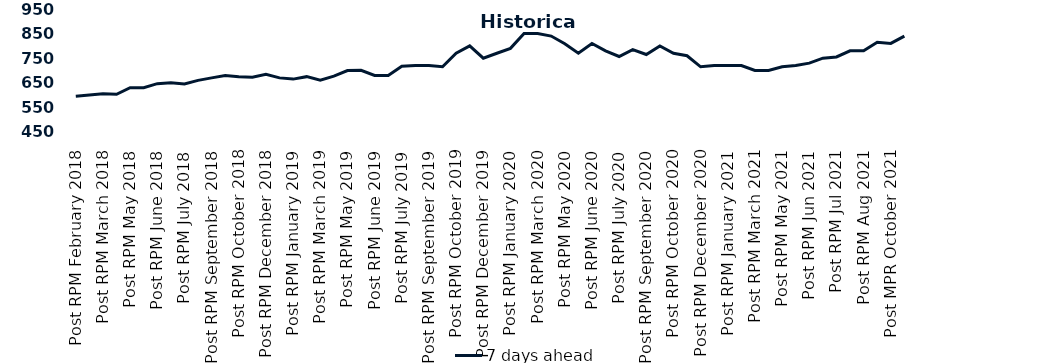
| Category | 7 days ahead |
|---|---|
| Post RPM February 2018 | 595 |
| Pre RPM March 2018 | 600 |
| Post RPM March 2018 | 605 |
| Pre RPM May 2018 | 603 |
| Post RPM May 2018 | 630 |
| Pre RPM June 2018 | 630 |
| Post RPM June 2018 | 646.5 |
| Pre RPM July 2018 | 650 |
| Post RPM July 2018 | 645 |
| Pre RPM September 2018 | 660 |
| Post RPM September 2018 | 670 |
| Pre RPM October 2018 | 680 |
| Post RPM October 2018 | 675 |
| Pre RPM December 2018 | 672.5 |
| Post RPM December 2018 | 685 |
| Pre RPM January 2019 | 670 |
| Post RPM January 2019 | 665 |
| Pre RPM March 2019 | 675 |
| Post RPM March 2019 | 661 |
| Pre RPM May 2019 | 677 |
| Post RPM May 2019 | 700 |
| Pre RPM June 2019 | 700.5 |
| Post RPM June 2019 | 680 |
| Pre RPM July 2019 | 680 |
| Post RPM July 2019 | 717.5 |
| Pre RPM September 2019 | 720 |
| Post RPM September 2019 | 720 |
| Pre RPM October 2019 | 715 |
| Post RPM October 2019 | 770 |
| Pre RPM December 2019 | 800 |
| Post RPM December 2019 | 750 |
| Pre RPM January 2020 | 770 |
| Post RPM January 2020 | 790 |
| Pre RPM March 2020 | 850 |
| Post RPM March 2020 | 850 |
| Pre RPM May 2020 | 840 |
| Post RPM May 2020 | 808.5 |
| Pre RPM June 2020 | 770 |
| Post RPM June 2020 | 810 |
| Pre RPM July 2020 | 780 |
| Post RPM July 2020 | 757 |
| Pre RPM September 2020 | 785 |
| Post RPM September 2020 | 765 |
| Pre RPM October 2020 | 800 |
| Post RPM October 2020 | 770 |
| Pre RPM December 2020 | 760 |
|  Post RPM December 2020 | 715 |
| Pre RPM January 2021 | 720 |
| Post RPM January 2021 | 720 |
|  Pre RPM March 2021 | 720 |
|  Post RPM March 2021 | 700 |
|  Pre RPM May 2021 | 700 |
|  Post RPM May 2021 | 715 |
|  Pre RPM Jun 2021 | 720 |
|   Post RPM Jun 2021 | 730 |
| Pre RPM Jul 2021 | 750 |
|  Post RPM Jul 2021 | 755 |
| Pre RPM Aug 2021 | 780 |
|  Post RPM Aug 2021 | 780 |
| Pre MPR October 2021 | 815 |
| Post MPR October 2021 | 810 |
| Pre MPR December 2021 | 840 |